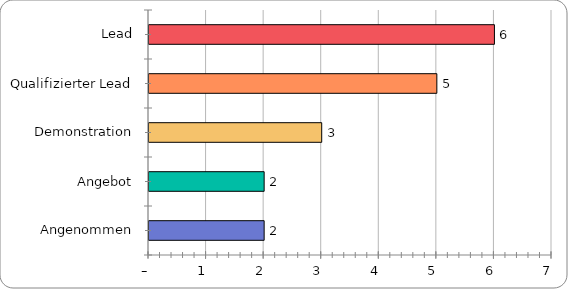
| Category | Series 0 |
|---|---|
| Lead | 6 |
| Qualifizierter Lead | 5 |
| Demonstration | 3 |
| Angebot | 2 |
| Angenommen | 2 |